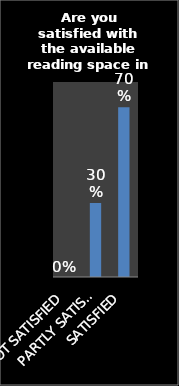
| Category | Series 0 |
|---|---|
| NOT SATISFIED | 0 |
| PARTLY SATISFIED | 0.303 |
| SATISFIED | 0.697 |